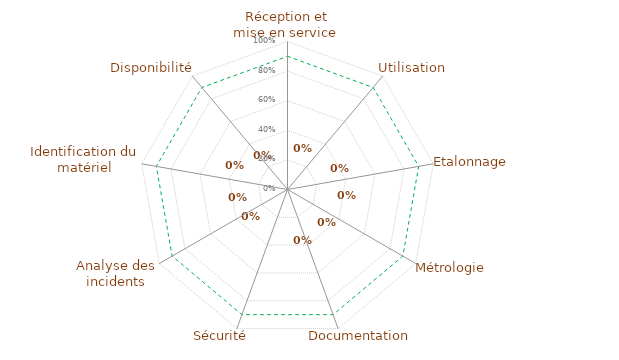
| Category | 90% | résultats |
|---|---|---|
| Réception et mise en service  | 0.9 | 0 |
| Utilisation | 0.9 | 0 |
| Etalonnage  | 0.9 | 0 |
| Métrologie | 0.9 | 0 |
| Documentation | 0.9 | 0 |
| Sécurité | 0.9 | 0 |
| Analyse des incidents | 0.9 | 0 |
| Identification du matériel | 0.9 | 0 |
| Disponibilité | 0.9 | 0 |